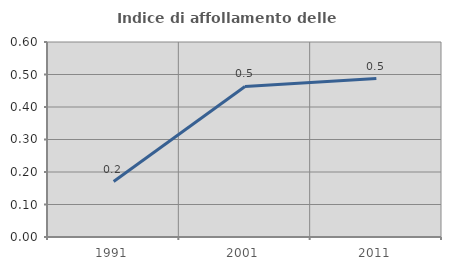
| Category | Indice di affollamento delle abitazioni  |
|---|---|
| 1991.0 | 0.171 |
| 2001.0 | 0.463 |
| 2011.0 | 0.488 |